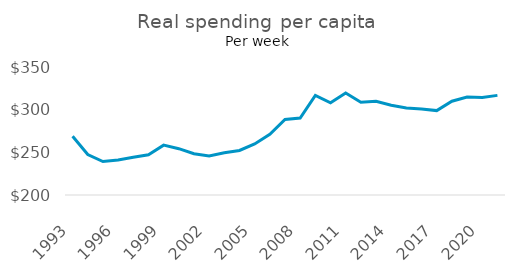
| Category | Series 0 |
|---|---|
| 1993-06-01 | 268.833 |
| 1994-06-01 | 247.468 |
| 1995-06-01 | 239.174 |
| 1996-06-01 | 240.998 |
| 1997-06-01 | 244.187 |
| 1998-06-01 | 247.162 |
| 1999-06-01 | 258.404 |
| 2000-06-01 | 254.286 |
| 2001-06-01 | 248.444 |
| 2002-06-01 | 245.851 |
| 2003-06-01 | 249.589 |
| 2004-06-01 | 252.17 |
| 2005-06-01 | 259.879 |
| 2006-06-01 | 271.239 |
| 2007-06-01 | 288.466 |
| 2008-06-01 | 290.228 |
| 2009-06-01 | 316.682 |
| 2010-06-01 | 308.106 |
| 2011-06-01 | 319.644 |
| 2012-06-01 | 308.767 |
| 2013-06-01 | 309.73 |
| 2014-06-01 | 305.195 |
| 2015-06-01 | 301.971 |
| 2016-06-01 | 300.859 |
| 2017-06-01 | 298.919 |
| 2018-06-01 | 309.905 |
| 2019-06-01 | 314.745 |
| 2020-06-01 | 314.336 |
| 2021-06-01 | 316.75 |